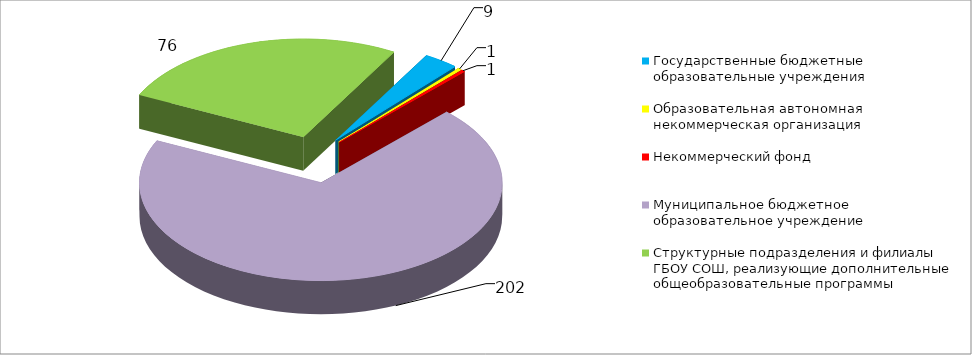
| Category | Series 0 | Series 1 | Series 2 |
|---|---|---|---|
| Государственные бюджетные образовательные учреждения  | 9 |  |  |
| Образовательная автономная некоммерческая организация | 1 |  |  |
| Некоммерческий фонд | 1 |  |  |
| Муниципальное бюджетное образовательное учреждение | 202 |  |  |
| Структурные подразделения и филиалы ГБОУ СОШ, реализующие дополнительные общеобразовательные программы | 76 |  |  |